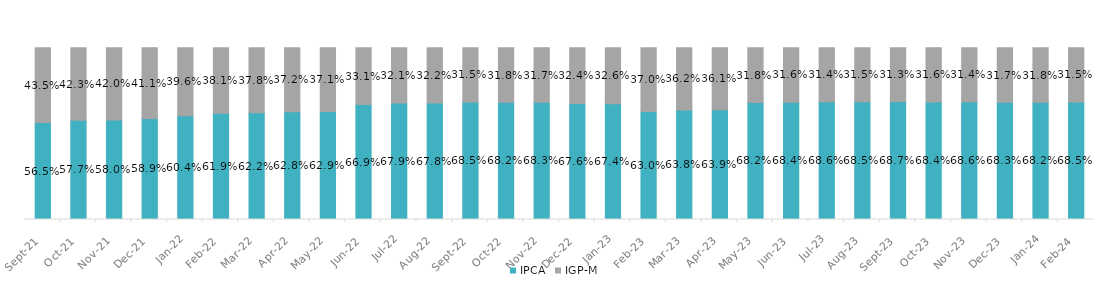
| Category | IPCA | IGP-M |
|---|---|---|
| 2021-09-01 | 0.565 | 0.435 |
| 2021-10-01 | 0.577 | 0.423 |
| 2021-11-01 | 0.58 | 0.42 |
| 2021-12-01 | 0.589 | 0.411 |
| 2022-01-01 | 0.604 | 0.396 |
| 2022-02-01 | 0.619 | 0.381 |
| 2022-03-01 | 0.622 | 0.378 |
| 2022-04-01 | 0.628 | 0.372 |
| 2022-05-01 | 0.629 | 0.371 |
| 2022-06-01 | 0.669 | 0.331 |
| 2022-07-31 | 0.679 | 0.321 |
| 2022-08-31 | 0.678 | 0.322 |
| 2022-09-01 | 0.685 | 0.315 |
| 2022-10-01 | 0.682 | 0.318 |
| 2022-11-01 | 0.683 | 0.317 |
| 2022-12-01 | 0.676 | 0.324 |
| 2023-01-01 | 0.674 | 0.326 |
| 2023-02-01 | 0.63 | 0.37 |
| 2023-03-01 | 0.638 | 0.362 |
| 2023-04-01 | 0.639 | 0.361 |
| 2023-05-01 | 0.682 | 0.318 |
| 2023-06-01 | 0.684 | 0.316 |
| 2023-07-01 | 0.686 | 0.314 |
| 2023-08-01 | 0.685 | 0.315 |
| 2023-09-01 | 0.687 | 0.313 |
| 2023-10-01 | 0.684 | 0.316 |
| 2023-11-01 | 0.686 | 0.314 |
| 2023-12-01 | 0.683 | 0.317 |
| 2024-01-01 | 0.682 | 0.318 |
| 2024-02-01 | 0.685 | 0.315 |